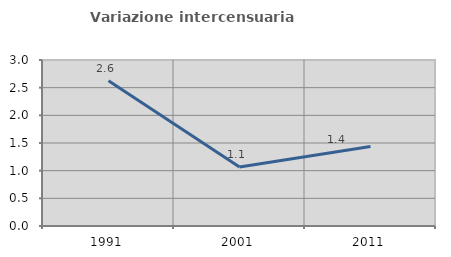
| Category | Variazione intercensuaria annua |
|---|---|
| 1991.0 | 2.624 |
| 2001.0 | 1.065 |
| 2011.0 | 1.435 |